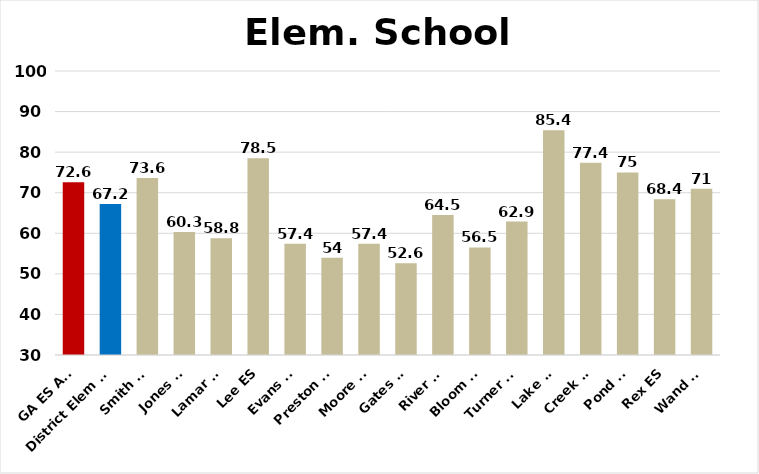
| Category | 2014 CCRPI |
|---|---|
| GA ES Avg | 72.6 |
| District Elem Avg | 67.2 |
| Smith ES | 73.6 |
| Jones ES | 60.3 |
| Lamar ES | 58.8 |
| Lee ES | 78.5 |
| Evans ES | 57.4 |
| Preston ES | 54 |
| Moore ES | 57.4 |
| Gates ES | 52.6 |
| River ES | 64.5 |
| Bloom ES | 56.5 |
| Turner ES | 62.9 |
| Lake ES | 85.4 |
| Creek ES | 77.4 |
| Pond ES | 75 |
| Rex ES | 68.4 |
| Wand ES | 71 |